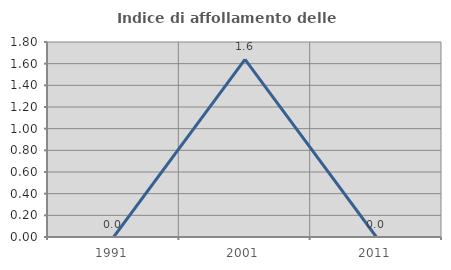
| Category | Indice di affollamento delle abitazioni  |
|---|---|
| 1991.0 | 0 |
| 2001.0 | 1.639 |
| 2011.0 | 0 |